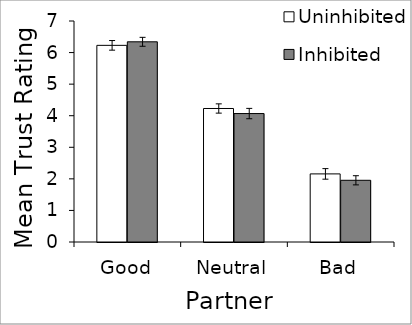
| Category | Uninhibited | Inhibited |
|---|---|---|
| Good | 6.229 | 6.341 |
| Neutral | 4.229 | 4.068 |
| Bad | 2.157 | 1.955 |